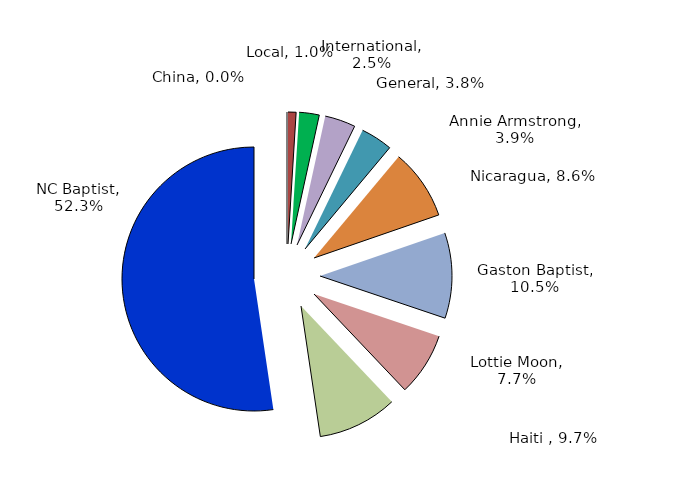
| Category | Percentage | Missions |
|---|---|---|
| China | 0 | 0 |
| Local | 0.01 | 0 |
| International | 0.025 | 0 |
| General | 0.038 | 0 |
| Annie Armstrong | 0.039 | 0 |
| Nicaragua | 0.086 | 0 |
| Gaston Baptist | 0.105 | 0 |
| Lottie Moon | 0.077 | 0 |
| Haiti  | 0.097 | 0 |
| NC Baptist | 0.523 | 0 |